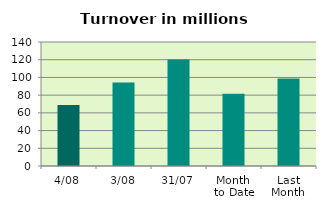
| Category | Series 0 |
|---|---|
| 4/08 | 68.814 |
| 3/08 | 94.375 |
| 31/07 | 120.142 |
| Month 
to Date | 81.594 |
| Last
Month | 98.668 |